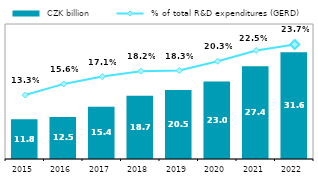
| Category |  CZK billion |
|---|---|
| 2015.0 | 11.763 |
| 2016.0 | 12.477 |
| 2017.0 | 15.448 |
| 2018.0 | 18.72 |
| 2019.0 | 20.474 |
| 2020.0 | 22.975 |
| 2021.0 | 27.45 |
| 2022.0 | 31.643 |